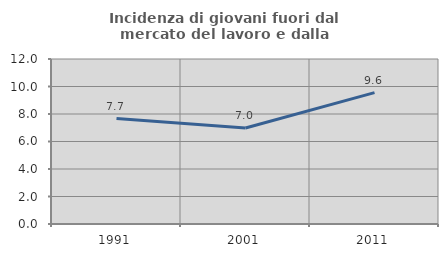
| Category | Incidenza di giovani fuori dal mercato del lavoro e dalla formazione  |
|---|---|
| 1991.0 | 7.666 |
| 2001.0 | 6.986 |
| 2011.0 | 9.552 |